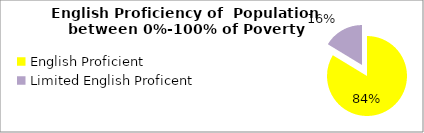
| Category | Percent |
|---|---|
| English Proficient | 0.837 |
| Limited English Proficent | 0.163 |